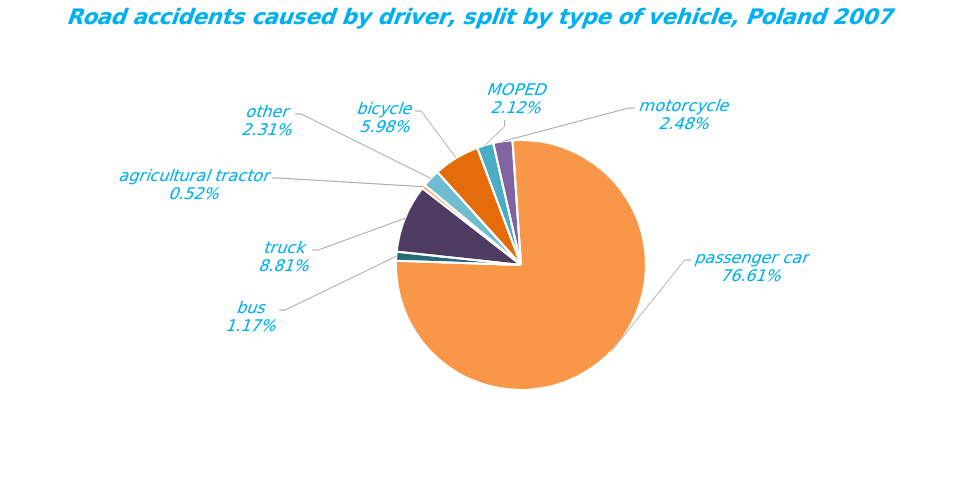
| Category | Series 0 |
|---|---|
| bicycle | 2299 |
| MOPED | 815 |
| motorcycle | 953 |
| passenger car | 29445 |
| bus | 450 |
| truck | 3387 |
| agricultural tractor | 197 |
| other | 888 |